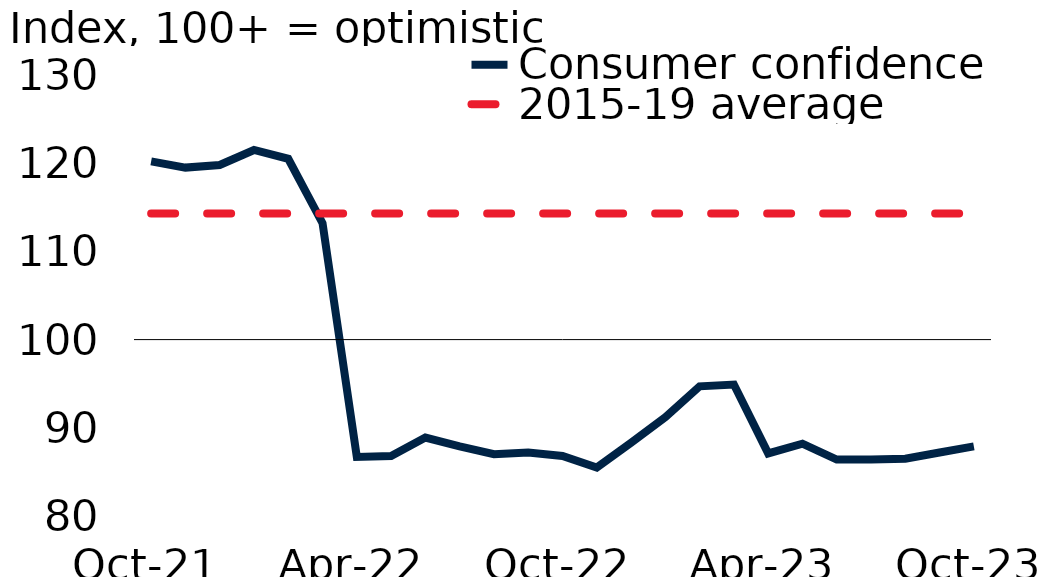
| Category | Consumer confidence | 2015-19 average |
|---|---|---|
| 2021-10-31 | 120.2 | 114.3 |
| 2021-11-30 | 119.5 | 114.3 |
| 2021-12-31 | 119.8 | 114.3 |
| 2022-01-31 | 121.5 | 114.3 |
| 2022-02-28 | 120.5 | 114.3 |
| 2022-03-31 | 113.2 | 114.3 |
| 2022-04-30 | 86.7 | 114.3 |
| 2022-05-31 | 86.8 | 114.3 |
| 2022-06-30 | 88.9 | 114.3 |
| 2022-07-31 | 87.9 | 114.3 |
| 2022-08-31 | 87 | 114.3 |
| 2022-09-30 | 87.2 | 114.3 |
| 2022-10-31 | 86.8 | 114.3 |
| 2022-11-30 | 85.5 | 114.3 |
| 2022-12-31 | 88.3 | 114.3 |
| 2023-01-31 | 91.2 | 114.3 |
| 2023-02-28 | 94.7 | 114.3 |
| 2023-03-31 | 94.9 | 114.3 |
| 2023-04-30 | 87.1 | 114.3 |
| 2023-05-31 | 88.2 | 114.3 |
| 2023-06-30 | 86.4 | 114.3 |
| 2023-07-31 | 86.4 | 114.3 |
| 2023-08-31 | 86.5 | 114.3 |
| 2023-09-30 | 87.2 | 114.3 |
| 2023-10-31 | 87.9 | 114.3 |